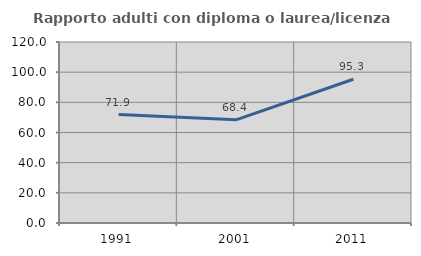
| Category | Rapporto adulti con diploma o laurea/licenza media  |
|---|---|
| 1991.0 | 71.875 |
| 2001.0 | 68.391 |
| 2011.0 | 95.296 |